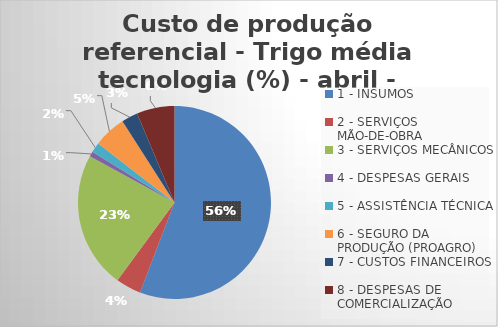
| Category | Series 0 |
|---|---|
| 1 - INSUMOS | 55.826 |
| 2 - SERVIÇOS MÃO-DE-OBRA | 4.232 |
| 3 - SERVIÇOS MECÂNICOS | 22.92 |
| 4 - DESPESAS GERAIS  | 0.83 |
| 5 - ASSISTÊNCIA TÉCNICA | 1.676 |
| 6 - SEGURO DA PRODUÇÃO (PROAGRO) | 5.448 |
| 7 - CUSTOS FINANCEIROS | 2.728 |
| 8 - DESPESAS DE COMERCIALIZAÇÃO | 6.34 |